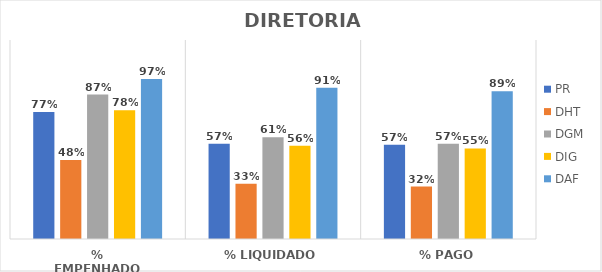
| Category | PR | DHT | DGM | DIG | DAF |
|---|---|---|---|---|---|
| % EMPENHADO | 0.766 | 0.477 | 0.871 | 0.777 | 0.966 |
| % LIQUIDADO | 0.575 | 0.333 | 0.613 | 0.562 | 0.912 |
| % PAGO | 0.569 | 0.316 | 0.574 | 0.546 | 0.892 |